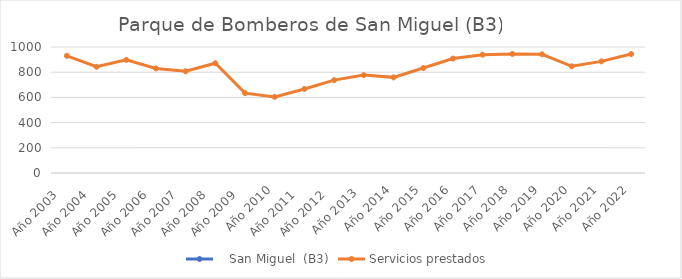
| Category |    San Miguel  (B3) | Servicios prestados  |
|---|---|---|
| Año 2003   |  | 930 |
| Año 2004   |  | 843 |
| Año 2005   |  | 898 |
| Año 2006   |  | 830 |
| Año 2007   |  | 807 |
| Año 2008   |  | 871 |
| Año 2009   |  | 634 |
| Año 2010 |  | 604 |
| Año 2011   |  | 667 |
| Año 2012   |  | 737 |
| Año 2013  |  | 777 |
| Año 2014 |  | 759 |
| Año 2015 |  | 833 |
| Año 2016 |  | 908 |
| Año 2017 |  | 939 |
| Año 2018 |  | 945 |
| Año 2019 |  | 942 |
| Año 2020 |  | 847 |
| Año 2021 |  | 886 |
| Año 2022 |  | 944 |